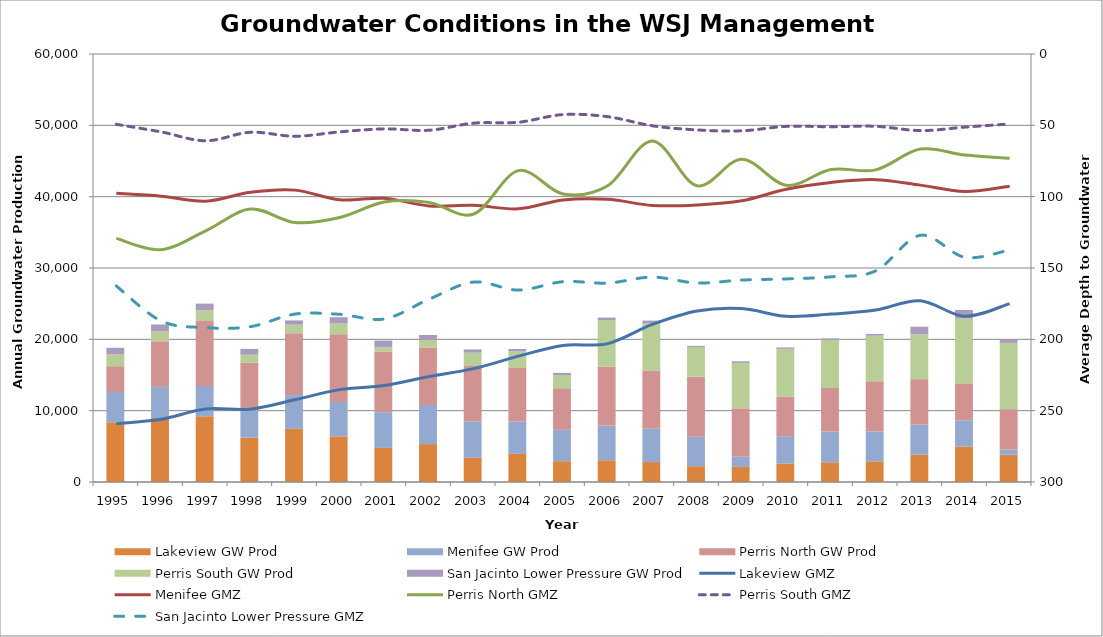
| Category | Lakeview GW Prod | Menifee GW Prod | Perris North GW Prod | Perris South GW Prod | San Jacinto Lower Pressure GW Prod |
|---|---|---|---|---|---|
| 1995.0 | 8372.1 | 4241.51 | 3614.56 | 1658.44 | 923.69 |
| 1996.0 | 8968.72 | 4360.43 | 6396.5 | 1374.59 | 983.79 |
| 1997.0 | 9214.65 | 4240.69 | 9120.55 | 1502.61 | 928.76 |
| 1998.0 | 6214.61 | 3883.7 | 6607.68 | 1137.83 | 816.74 |
| 1999.0 | 7451.63 | 4730.64 | 8679.67 | 1195.89 | 594.72 |
| 2000.0 | 6393.47 | 4829.53 | 9494.25 | 1505.8 | 879.71 |
| 2001.0 | 4776.881 | 5019.733 | 8488.599 | 610.17 | 935.599 |
| 2002.0 | 5313.461 | 5477.19 | 8053.073 | 1077.693 | 684.65 |
| 2003.0 | 3395.397 | 5115.73 | 7748.28 | 1869.75 | 450.402 |
| 2004.0 | 3941.981 | 4538.38 | 7507.723 | 2315.78 | 344.74 |
| 2005.0 | 2915.128 | 4405.83 | 5821.631 | 1842.98 | 312.04 |
| 2006.0 | 3048.639 | 4859.44 | 8283.561 | 6454.66 | 407.59 |
| 2007.0 | 2790.469 | 4724.28 | 8065.474 | 6629.54 | 416.14 |
| 2008.0 | 2213.856 | 4131.195 | 8424.12 | 4166.04 | 148.827 |
| 2009.0 | 2118.89 | 1420.99 | 6788.585 | 6367.46 | 228.198 |
| 2010.0 | 2596.85 | 3827.99 | 5531 | 6712.08 | 199.94 |
| 2011.0 | 2763.07 | 4306.69 | 6111.92 | 6770.43 | 175.071 |
| 2012.0 | 2901.339 | 4189.33 | 7029.32 | 6390.52 | 244.37 |
| 2013.0 | 3831.262 | 4228.673 | 6358.989 | 6280.911 | 1067.515 |
| 2014.0 | 4968.409 | 3684.859 | 5183.098 | 9108.057 | 1168.088 |
| 2015.0 | 3832.1 | 709.596 | 5669.813 | 9288.561 | 503.963 |